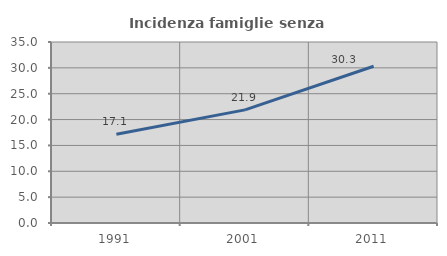
| Category | Incidenza famiglie senza nuclei |
|---|---|
| 1991.0 | 17.148 |
| 2001.0 | 21.88 |
| 2011.0 | 30.319 |